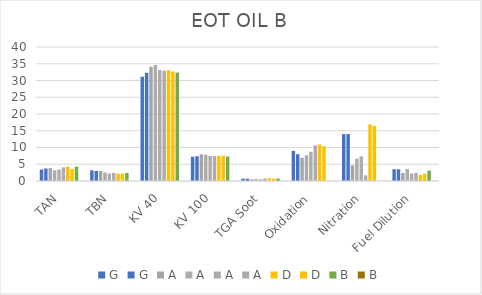
| Category | G | A | D | B |
|---|---|---|---|---|
| TAN | 3.73 | 4.08 | 3.6 |  |
| TBN | 3 | 2.43 | 2.2 |  |
| KV 40 | 32.31 | 32.91 | 32.69 |  |
| KV 100 | 7.39 | 7.454 | 7.512 |  |
| TGA Soot | 0.7 | 0.735 | 0.707 |  |
| Oxidation | 8 | 10.61 | 10.39 |  |
| Nitration | 14 | 1.68 | 16.43 |  |
| Fuel Dilution | 3.5 | 2.4 | 2.2 |  |